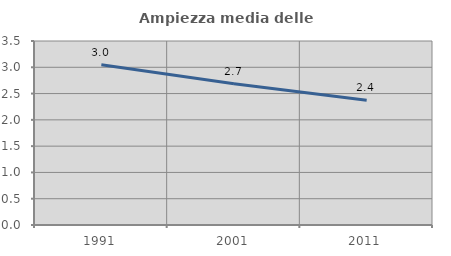
| Category | Ampiezza media delle famiglie |
|---|---|
| 1991.0 | 3.047 |
| 2001.0 | 2.688 |
| 2011.0 | 2.371 |